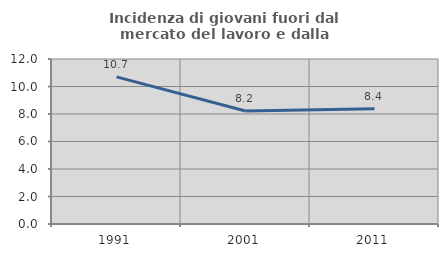
| Category | Incidenza di giovani fuori dal mercato del lavoro e dalla formazione  |
|---|---|
| 1991.0 | 10.702 |
| 2001.0 | 8.216 |
| 2011.0 | 8.378 |